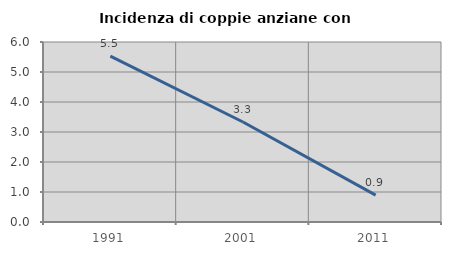
| Category | Incidenza di coppie anziane con figli |
|---|---|
| 1991.0 | 5.53 |
| 2001.0 | 3.333 |
| 2011.0 | 0.897 |